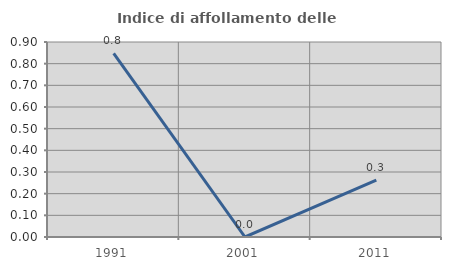
| Category | Indice di affollamento delle abitazioni  |
|---|---|
| 1991.0 | 0.847 |
| 2001.0 | 0 |
| 2011.0 | 0.262 |